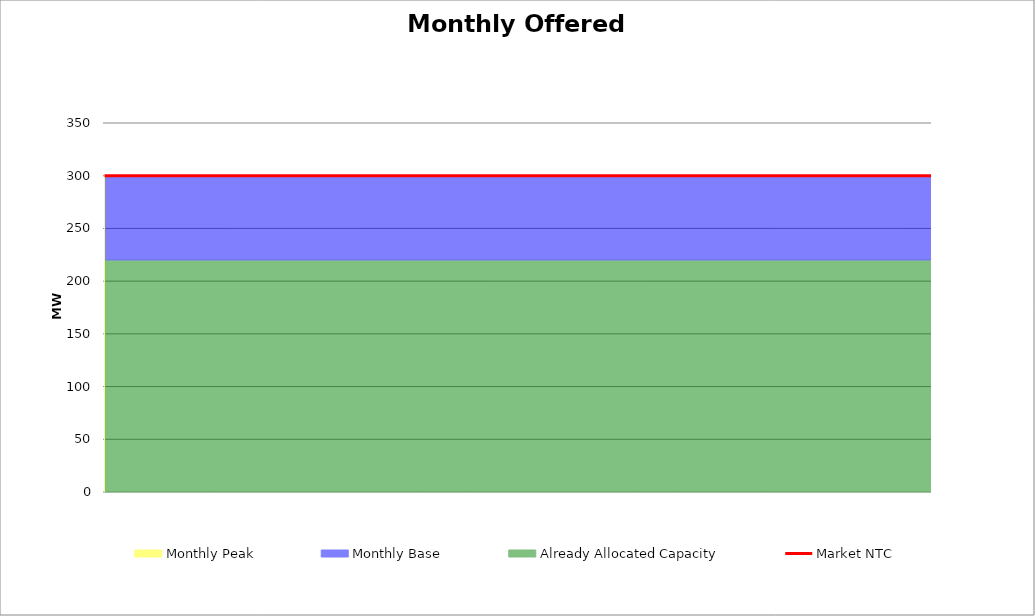
| Category | Market NTC |
|---|---|
| 0 | 300 |
| 1 | 300 |
| 2 | 300 |
| 3 | 300 |
| 4 | 300 |
| 5 | 300 |
| 6 | 300 |
| 7 | 300 |
| 8 | 300 |
| 9 | 300 |
| 10 | 300 |
| 11 | 300 |
| 12 | 300 |
| 13 | 300 |
| 14 | 300 |
| 15 | 300 |
| 16 | 300 |
| 17 | 300 |
| 18 | 300 |
| 19 | 300 |
| 20 | 300 |
| 21 | 300 |
| 22 | 300 |
| 23 | 300 |
| 24 | 300 |
| 25 | 300 |
| 26 | 300 |
| 27 | 300 |
| 28 | 300 |
| 29 | 300 |
| 30 | 300 |
| 31 | 300 |
| 32 | 300 |
| 33 | 300 |
| 34 | 300 |
| 35 | 300 |
| 36 | 300 |
| 37 | 300 |
| 38 | 300 |
| 39 | 300 |
| 40 | 300 |
| 41 | 300 |
| 42 | 300 |
| 43 | 300 |
| 44 | 300 |
| 45 | 300 |
| 46 | 300 |
| 47 | 300 |
| 48 | 300 |
| 49 | 300 |
| 50 | 300 |
| 51 | 300 |
| 52 | 300 |
| 53 | 300 |
| 54 | 300 |
| 55 | 300 |
| 56 | 300 |
| 57 | 300 |
| 58 | 300 |
| 59 | 300 |
| 60 | 300 |
| 61 | 300 |
| 62 | 300 |
| 63 | 300 |
| 64 | 300 |
| 65 | 300 |
| 66 | 300 |
| 67 | 300 |
| 68 | 300 |
| 69 | 300 |
| 70 | 300 |
| 71 | 300 |
| 72 | 300 |
| 73 | 300 |
| 74 | 300 |
| 75 | 300 |
| 76 | 300 |
| 77 | 300 |
| 78 | 300 |
| 79 | 300 |
| 80 | 300 |
| 81 | 300 |
| 82 | 300 |
| 83 | 300 |
| 84 | 300 |
| 85 | 300 |
| 86 | 300 |
| 87 | 300 |
| 88 | 300 |
| 89 | 300 |
| 90 | 300 |
| 91 | 300 |
| 92 | 300 |
| 93 | 300 |
| 94 | 300 |
| 95 | 300 |
| 96 | 300 |
| 97 | 300 |
| 98 | 300 |
| 99 | 300 |
| 100 | 300 |
| 101 | 300 |
| 102 | 300 |
| 103 | 300 |
| 104 | 300 |
| 105 | 300 |
| 106 | 300 |
| 107 | 300 |
| 108 | 300 |
| 109 | 300 |
| 110 | 300 |
| 111 | 300 |
| 112 | 300 |
| 113 | 300 |
| 114 | 300 |
| 115 | 300 |
| 116 | 300 |
| 117 | 300 |
| 118 | 300 |
| 119 | 300 |
| 120 | 300 |
| 121 | 300 |
| 122 | 300 |
| 123 | 300 |
| 124 | 300 |
| 125 | 300 |
| 126 | 300 |
| 127 | 300 |
| 128 | 300 |
| 129 | 300 |
| 130 | 300 |
| 131 | 300 |
| 132 | 300 |
| 133 | 300 |
| 134 | 300 |
| 135 | 300 |
| 136 | 300 |
| 137 | 300 |
| 138 | 300 |
| 139 | 300 |
| 140 | 300 |
| 141 | 300 |
| 142 | 300 |
| 143 | 300 |
| 144 | 300 |
| 145 | 300 |
| 146 | 300 |
| 147 | 300 |
| 148 | 300 |
| 149 | 300 |
| 150 | 300 |
| 151 | 300 |
| 152 | 300 |
| 153 | 300 |
| 154 | 300 |
| 155 | 300 |
| 156 | 300 |
| 157 | 300 |
| 158 | 300 |
| 159 | 300 |
| 160 | 300 |
| 161 | 300 |
| 162 | 300 |
| 163 | 300 |
| 164 | 300 |
| 165 | 300 |
| 166 | 300 |
| 167 | 300 |
| 168 | 300 |
| 169 | 300 |
| 170 | 300 |
| 171 | 300 |
| 172 | 300 |
| 173 | 300 |
| 174 | 300 |
| 175 | 300 |
| 176 | 300 |
| 177 | 300 |
| 178 | 300 |
| 179 | 300 |
| 180 | 300 |
| 181 | 300 |
| 182 | 300 |
| 183 | 300 |
| 184 | 300 |
| 185 | 300 |
| 186 | 300 |
| 187 | 300 |
| 188 | 300 |
| 189 | 300 |
| 190 | 300 |
| 191 | 300 |
| 192 | 300 |
| 193 | 300 |
| 194 | 300 |
| 195 | 300 |
| 196 | 300 |
| 197 | 300 |
| 198 | 300 |
| 199 | 300 |
| 200 | 300 |
| 201 | 300 |
| 202 | 300 |
| 203 | 300 |
| 204 | 300 |
| 205 | 300 |
| 206 | 300 |
| 207 | 300 |
| 208 | 300 |
| 209 | 300 |
| 210 | 300 |
| 211 | 300 |
| 212 | 300 |
| 213 | 300 |
| 214 | 300 |
| 215 | 300 |
| 216 | 300 |
| 217 | 300 |
| 218 | 300 |
| 219 | 300 |
| 220 | 300 |
| 221 | 300 |
| 222 | 300 |
| 223 | 300 |
| 224 | 300 |
| 225 | 300 |
| 226 | 300 |
| 227 | 300 |
| 228 | 300 |
| 229 | 300 |
| 230 | 300 |
| 231 | 300 |
| 232 | 300 |
| 233 | 300 |
| 234 | 300 |
| 235 | 300 |
| 236 | 300 |
| 237 | 300 |
| 238 | 300 |
| 239 | 300 |
| 240 | 300 |
| 241 | 300 |
| 242 | 300 |
| 243 | 300 |
| 244 | 300 |
| 245 | 300 |
| 246 | 300 |
| 247 | 300 |
| 248 | 300 |
| 249 | 300 |
| 250 | 300 |
| 251 | 300 |
| 252 | 300 |
| 253 | 300 |
| 254 | 300 |
| 255 | 300 |
| 256 | 300 |
| 257 | 300 |
| 258 | 300 |
| 259 | 300 |
| 260 | 300 |
| 261 | 300 |
| 262 | 300 |
| 263 | 300 |
| 264 | 300 |
| 265 | 300 |
| 266 | 300 |
| 267 | 300 |
| 268 | 300 |
| 269 | 300 |
| 270 | 300 |
| 271 | 300 |
| 272 | 300 |
| 273 | 300 |
| 274 | 300 |
| 275 | 300 |
| 276 | 300 |
| 277 | 300 |
| 278 | 300 |
| 279 | 300 |
| 280 | 300 |
| 281 | 300 |
| 282 | 300 |
| 283 | 300 |
| 284 | 300 |
| 285 | 300 |
| 286 | 300 |
| 287 | 300 |
| 288 | 300 |
| 289 | 300 |
| 290 | 300 |
| 291 | 300 |
| 292 | 300 |
| 293 | 300 |
| 294 | 300 |
| 295 | 300 |
| 296 | 300 |
| 297 | 300 |
| 298 | 300 |
| 299 | 300 |
| 300 | 300 |
| 301 | 300 |
| 302 | 300 |
| 303 | 300 |
| 304 | 300 |
| 305 | 300 |
| 306 | 300 |
| 307 | 300 |
| 308 | 300 |
| 309 | 300 |
| 310 | 300 |
| 311 | 300 |
| 312 | 300 |
| 313 | 300 |
| 314 | 300 |
| 315 | 300 |
| 316 | 300 |
| 317 | 300 |
| 318 | 300 |
| 319 | 300 |
| 320 | 300 |
| 321 | 300 |
| 322 | 300 |
| 323 | 300 |
| 324 | 300 |
| 325 | 300 |
| 326 | 300 |
| 327 | 300 |
| 328 | 300 |
| 329 | 300 |
| 330 | 300 |
| 331 | 300 |
| 332 | 300 |
| 333 | 300 |
| 334 | 300 |
| 335 | 300 |
| 336 | 300 |
| 337 | 300 |
| 338 | 300 |
| 339 | 300 |
| 340 | 300 |
| 341 | 300 |
| 342 | 300 |
| 343 | 300 |
| 344 | 300 |
| 345 | 300 |
| 346 | 300 |
| 347 | 300 |
| 348 | 300 |
| 349 | 300 |
| 350 | 300 |
| 351 | 300 |
| 352 | 300 |
| 353 | 300 |
| 354 | 300 |
| 355 | 300 |
| 356 | 300 |
| 357 | 300 |
| 358 | 300 |
| 359 | 300 |
| 360 | 300 |
| 361 | 300 |
| 362 | 300 |
| 363 | 300 |
| 364 | 300 |
| 365 | 300 |
| 366 | 300 |
| 367 | 300 |
| 368 | 300 |
| 369 | 300 |
| 370 | 300 |
| 371 | 300 |
| 372 | 300 |
| 373 | 300 |
| 374 | 300 |
| 375 | 300 |
| 376 | 300 |
| 377 | 300 |
| 378 | 300 |
| 379 | 300 |
| 380 | 300 |
| 381 | 300 |
| 382 | 300 |
| 383 | 300 |
| 384 | 300 |
| 385 | 300 |
| 386 | 300 |
| 387 | 300 |
| 388 | 300 |
| 389 | 300 |
| 390 | 300 |
| 391 | 300 |
| 392 | 300 |
| 393 | 300 |
| 394 | 300 |
| 395 | 300 |
| 396 | 300 |
| 397 | 300 |
| 398 | 300 |
| 399 | 300 |
| 400 | 300 |
| 401 | 300 |
| 402 | 300 |
| 403 | 300 |
| 404 | 300 |
| 405 | 300 |
| 406 | 300 |
| 407 | 300 |
| 408 | 300 |
| 409 | 300 |
| 410 | 300 |
| 411 | 300 |
| 412 | 300 |
| 413 | 300 |
| 414 | 300 |
| 415 | 300 |
| 416 | 300 |
| 417 | 300 |
| 418 | 300 |
| 419 | 300 |
| 420 | 300 |
| 421 | 300 |
| 422 | 300 |
| 423 | 300 |
| 424 | 300 |
| 425 | 300 |
| 426 | 300 |
| 427 | 300 |
| 428 | 300 |
| 429 | 300 |
| 430 | 300 |
| 431 | 300 |
| 432 | 300 |
| 433 | 300 |
| 434 | 300 |
| 435 | 300 |
| 436 | 300 |
| 437 | 300 |
| 438 | 300 |
| 439 | 300 |
| 440 | 300 |
| 441 | 300 |
| 442 | 300 |
| 443 | 300 |
| 444 | 300 |
| 445 | 300 |
| 446 | 300 |
| 447 | 300 |
| 448 | 300 |
| 449 | 300 |
| 450 | 300 |
| 451 | 300 |
| 452 | 300 |
| 453 | 300 |
| 454 | 300 |
| 455 | 300 |
| 456 | 300 |
| 457 | 300 |
| 458 | 300 |
| 459 | 300 |
| 460 | 300 |
| 461 | 300 |
| 462 | 300 |
| 463 | 300 |
| 464 | 300 |
| 465 | 300 |
| 466 | 300 |
| 467 | 300 |
| 468 | 300 |
| 469 | 300 |
| 470 | 300 |
| 471 | 300 |
| 472 | 300 |
| 473 | 300 |
| 474 | 300 |
| 475 | 300 |
| 476 | 300 |
| 477 | 300 |
| 478 | 300 |
| 479 | 300 |
| 480 | 300 |
| 481 | 300 |
| 482 | 300 |
| 483 | 300 |
| 484 | 300 |
| 485 | 300 |
| 486 | 300 |
| 487 | 300 |
| 488 | 300 |
| 489 | 300 |
| 490 | 300 |
| 491 | 300 |
| 492 | 300 |
| 493 | 300 |
| 494 | 300 |
| 495 | 300 |
| 496 | 300 |
| 497 | 300 |
| 498 | 300 |
| 499 | 300 |
| 500 | 300 |
| 501 | 300 |
| 502 | 300 |
| 503 | 300 |
| 504 | 300 |
| 505 | 300 |
| 506 | 300 |
| 507 | 300 |
| 508 | 300 |
| 509 | 300 |
| 510 | 300 |
| 511 | 300 |
| 512 | 300 |
| 513 | 300 |
| 514 | 300 |
| 515 | 300 |
| 516 | 300 |
| 517 | 300 |
| 518 | 300 |
| 519 | 300 |
| 520 | 300 |
| 521 | 300 |
| 522 | 300 |
| 523 | 300 |
| 524 | 300 |
| 525 | 300 |
| 526 | 300 |
| 527 | 300 |
| 528 | 300 |
| 529 | 300 |
| 530 | 300 |
| 531 | 300 |
| 532 | 300 |
| 533 | 300 |
| 534 | 300 |
| 535 | 300 |
| 536 | 300 |
| 537 | 300 |
| 538 | 300 |
| 539 | 300 |
| 540 | 300 |
| 541 | 300 |
| 542 | 300 |
| 543 | 300 |
| 544 | 300 |
| 545 | 300 |
| 546 | 300 |
| 547 | 300 |
| 548 | 300 |
| 549 | 300 |
| 550 | 300 |
| 551 | 300 |
| 552 | 300 |
| 553 | 300 |
| 554 | 300 |
| 555 | 300 |
| 556 | 300 |
| 557 | 300 |
| 558 | 300 |
| 559 | 300 |
| 560 | 300 |
| 561 | 300 |
| 562 | 300 |
| 563 | 300 |
| 564 | 300 |
| 565 | 300 |
| 566 | 300 |
| 567 | 300 |
| 568 | 300 |
| 569 | 300 |
| 570 | 300 |
| 571 | 300 |
| 572 | 300 |
| 573 | 300 |
| 574 | 300 |
| 575 | 300 |
| 576 | 300 |
| 577 | 300 |
| 578 | 300 |
| 579 | 300 |
| 580 | 300 |
| 581 | 300 |
| 582 | 300 |
| 583 | 300 |
| 584 | 300 |
| 585 | 300 |
| 586 | 300 |
| 587 | 300 |
| 588 | 300 |
| 589 | 300 |
| 590 | 300 |
| 591 | 300 |
| 592 | 300 |
| 593 | 300 |
| 594 | 300 |
| 595 | 300 |
| 596 | 300 |
| 597 | 300 |
| 598 | 300 |
| 599 | 300 |
| 600 | 300 |
| 601 | 300 |
| 602 | 300 |
| 603 | 300 |
| 604 | 300 |
| 605 | 300 |
| 606 | 300 |
| 607 | 300 |
| 608 | 300 |
| 609 | 300 |
| 610 | 300 |
| 611 | 300 |
| 612 | 300 |
| 613 | 300 |
| 614 | 300 |
| 615 | 300 |
| 616 | 300 |
| 617 | 300 |
| 618 | 300 |
| 619 | 300 |
| 620 | 300 |
| 621 | 300 |
| 622 | 300 |
| 623 | 300 |
| 624 | 300 |
| 625 | 300 |
| 626 | 300 |
| 627 | 300 |
| 628 | 300 |
| 629 | 300 |
| 630 | 300 |
| 631 | 300 |
| 632 | 300 |
| 633 | 300 |
| 634 | 300 |
| 635 | 300 |
| 636 | 300 |
| 637 | 300 |
| 638 | 300 |
| 639 | 300 |
| 640 | 300 |
| 641 | 300 |
| 642 | 300 |
| 643 | 300 |
| 644 | 300 |
| 645 | 300 |
| 646 | 300 |
| 647 | 300 |
| 648 | 300 |
| 649 | 300 |
| 650 | 300 |
| 651 | 300 |
| 652 | 300 |
| 653 | 300 |
| 654 | 300 |
| 655 | 300 |
| 656 | 300 |
| 657 | 300 |
| 658 | 300 |
| 659 | 300 |
| 660 | 300 |
| 661 | 300 |
| 662 | 300 |
| 663 | 300 |
| 664 | 300 |
| 665 | 300 |
| 666 | 300 |
| 667 | 300 |
| 668 | 300 |
| 669 | 300 |
| 670 | 300 |
| 671 | 300 |
| 672 | 300 |
| 673 | 300 |
| 674 | 300 |
| 675 | 300 |
| 676 | 300 |
| 677 | 300 |
| 678 | 300 |
| 679 | 300 |
| 680 | 300 |
| 681 | 300 |
| 682 | 300 |
| 683 | 300 |
| 684 | 300 |
| 685 | 300 |
| 686 | 300 |
| 687 | 300 |
| 688 | 300 |
| 689 | 300 |
| 690 | 300 |
| 691 | 300 |
| 692 | 300 |
| 693 | 300 |
| 694 | 300 |
| 695 | 300 |
| 696 | 300 |
| 697 | 300 |
| 698 | 300 |
| 699 | 300 |
| 700 | 300 |
| 701 | 300 |
| 702 | 300 |
| 703 | 300 |
| 704 | 300 |
| 705 | 300 |
| 706 | 300 |
| 707 | 300 |
| 708 | 300 |
| 709 | 300 |
| 710 | 300 |
| 711 | 300 |
| 712 | 300 |
| 713 | 300 |
| 714 | 300 |
| 715 | 300 |
| 716 | 300 |
| 717 | 300 |
| 718 | 300 |
| 719 | 300 |
| 720 | 300 |
| 721 | 300 |
| 722 | 300 |
| 723 | 300 |
| 724 | 300 |
| 725 | 300 |
| 726 | 300 |
| 727 | 300 |
| 728 | 300 |
| 729 | 300 |
| 730 | 300 |
| 731 | 300 |
| 732 | 300 |
| 733 | 300 |
| 734 | 300 |
| 735 | 300 |
| 736 | 300 |
| 737 | 300 |
| 738 | 300 |
| 739 | 300 |
| 740 | 300 |
| 741 | 300 |
| 742 | 300 |
| 743 | 300 |